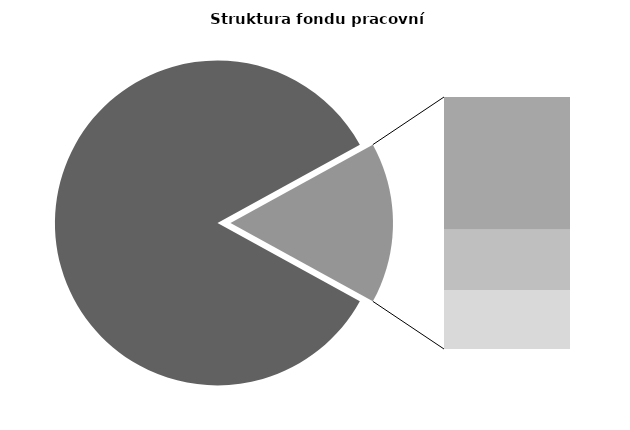
| Category | Series 0 |
|---|---|
| Průměrná měsíční odpracovaná doba bez přesčasu | 143.8 |
| Dovolená | 14.442 |
| Nemoc | 6.563 |
| Jiné | 6.423 |